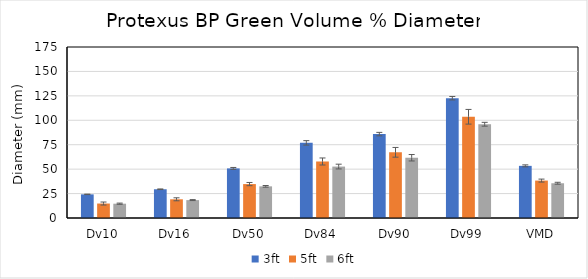
| Category | 3ft | 5ft | 6ft |
|---|---|---|---|
| Dv10 | 24.188 | 14.806 | 14.641 |
| Dv16 | 29.424 | 19.145 | 18.323 |
| Dv50 | 50.76 | 34.711 | 32.39 |
| Dv84 | 76.894 | 57.831 | 52.637 |
| Dv90 | 85.852 | 67.233 | 61.669 |
| Dv99 | 122.612 | 103.604 | 95.952 |
| VMD | 53.364 | 38.289 | 35.573 |